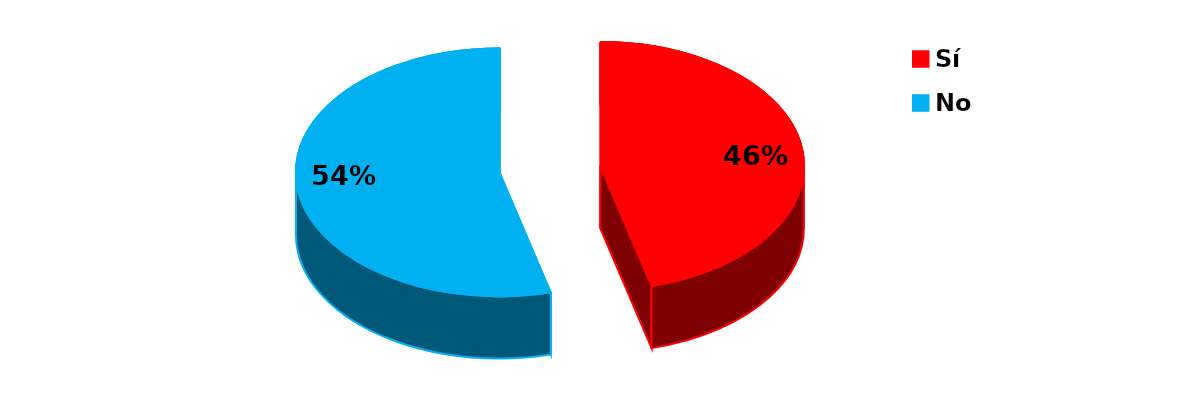
| Category | Series 0 |
|---|---|
| Sí | 51 |
| No | 60 |